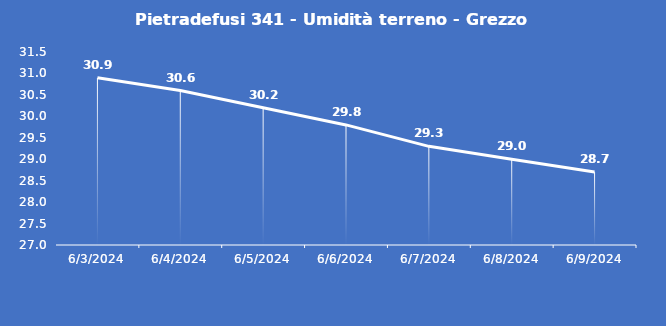
| Category | Pietradefusi 341 - Umidità terreno - Grezzo (%VWC) |
|---|---|
| 6/3/24 | 30.9 |
| 6/4/24 | 30.6 |
| 6/5/24 | 30.2 |
| 6/6/24 | 29.8 |
| 6/7/24 | 29.3 |
| 6/8/24 | 29 |
| 6/9/24 | 28.7 |